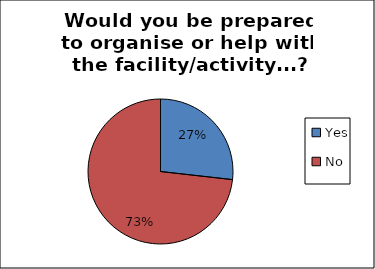
| Category | Series 0 |
|---|---|
| Yes | 0.268 |
| No | 0.732 |